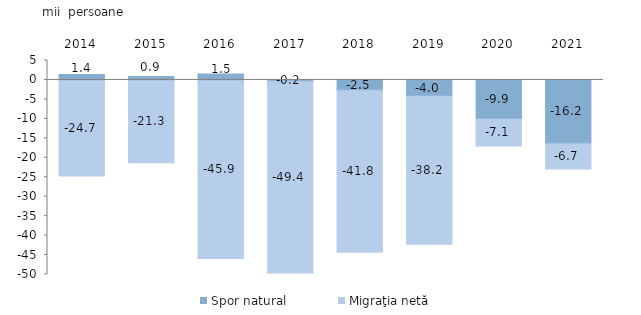
| Category | Spor natural | Migraţia netă  |
|---|---|---|
| 2014.0 | 1.4 | -24.7 |
| 2015.0 | 0.9 | -21.3 |
| 2016.0 | 1.5 | -45.9 |
| 2017.0 | -0.2 | -49.4 |
| 2018.0 | -2.5 | -41.8 |
| 2019.0 | -4 | -38.2 |
| 2020.0 | -9.9 | -7.1 |
| 2021.0 | -16.2 | -6.7 |